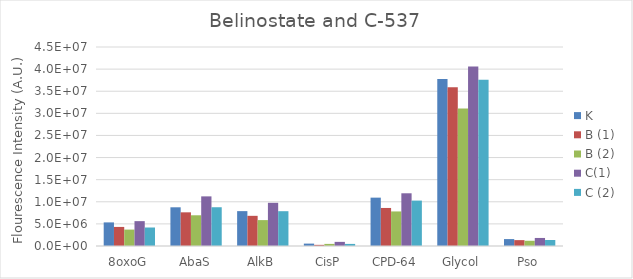
| Category | K | B (1) | B (2) | C(1) | C (2) |
|---|---|---|---|---|---|
| 8oxoG | 5337770.667 | 4314110 | 3711090 | 5621772 | 4182217 |
| AbaS | 8753230.167 | 7614099 | 6947473 | 11222855 | 8765817 |
| AlkB | 7885738.5 | 6822217 | 5857221 | 9766696 | 7869521 |
| CisP | 541308.833 | 258801 | 475116 | 934148 | 471853 |
| CPD-64 | 10935094.833 | 8602188 | 7815749 | 11921288 | 10268998 |
| Glycol | 37779662.833 | 35918553 | 31094146 | 40566942 | 37597286 |
| Pso | 1564265.333 | 1328408 | 1184086 | 1818466 | 1354674 |